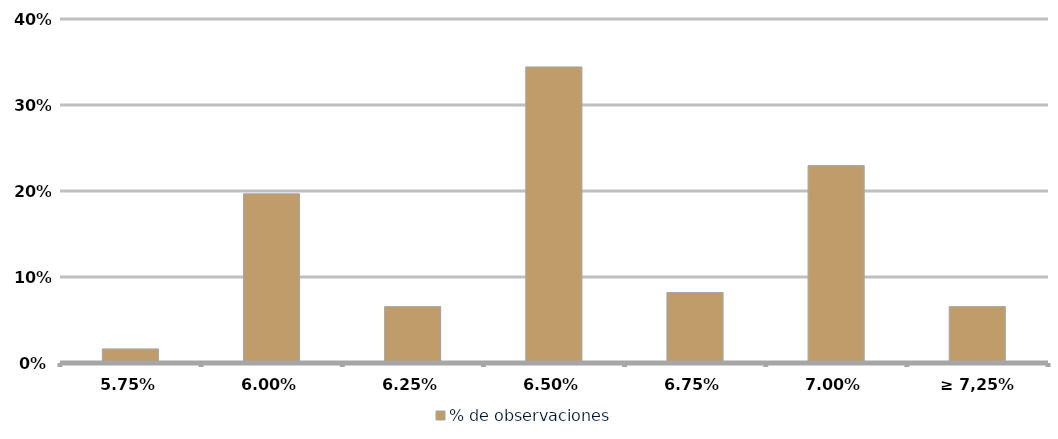
| Category | % de observaciones  |
|---|---|
| 5,75% | 0.016 |
| 6,00% | 0.197 |
| 6,25% | 0.066 |
| 6,50% | 0.344 |
| 6,75% | 0.082 |
| 7,00% | 0.23 |
| ≥ 7,25% | 0.066 |